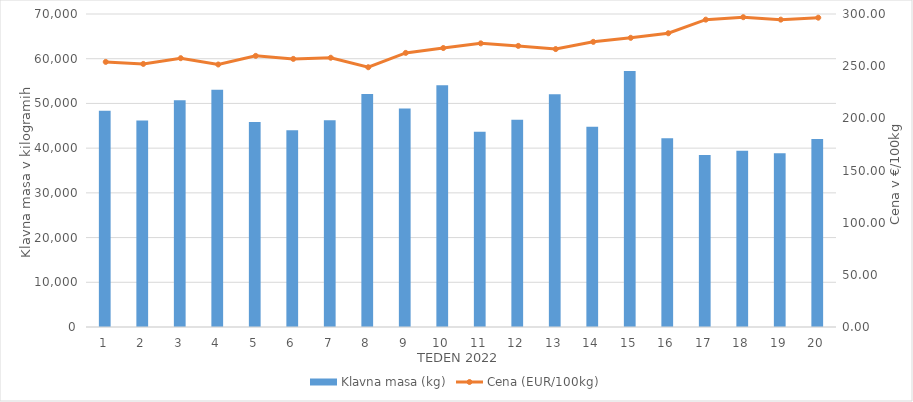
| Category | Klavna masa (kg) |
|---|---|
| 1.0 | 48349 |
| 2.0 | 46187 |
| 3.0 | 50692 |
| 4.0 | 53081 |
| 5.0 | 45844 |
| 6.0 | 43982 |
| 7.0 | 46227 |
| 8.0 | 52099 |
| 9.0 | 48872 |
| 10.0 | 54045 |
| 11.0 | 43645 |
| 12.0 | 46350 |
| 13.0 | 52061 |
| 14.0 | 44774 |
| 15.0 | 57268 |
| 16.0 | 42191 |
| 17.0 | 38469 |
| 18.0 | 39417 |
| 19.0 | 38876 |
| 20.0 | 42047 |